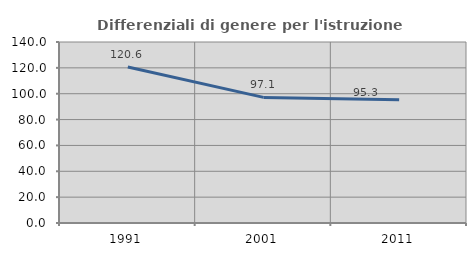
| Category | Differenziali di genere per l'istruzione superiore |
|---|---|
| 1991.0 | 120.629 |
| 2001.0 | 97.143 |
| 2011.0 | 95.318 |